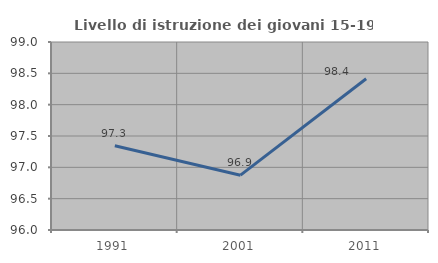
| Category | Livello di istruzione dei giovani 15-19 anni |
|---|---|
| 1991.0 | 97.345 |
| 2001.0 | 96.875 |
| 2011.0 | 98.413 |